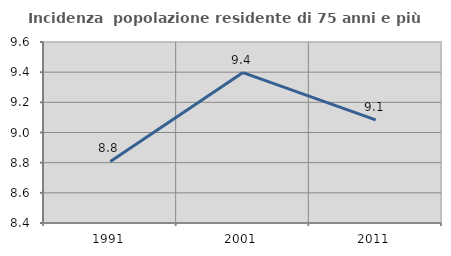
| Category | Incidenza  popolazione residente di 75 anni e più |
|---|---|
| 1991.0 | 8.808 |
| 2001.0 | 9.398 |
| 2011.0 | 9.084 |